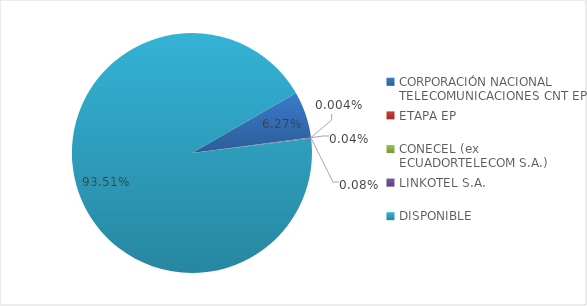
| Category | CÓDIGO DE ÁREA 3 |
|---|---|
| CORPORACIÓN NACIONAL TELECOMUNICACIONES CNT EP | 0.063 |
| ETAPA EP | 0 |
| CONECEL (ex ECUADORTELECOM S.A.) | 0 |
| LINKOTEL S.A. | 0.001 |
| DISPONIBLE | 0.935 |